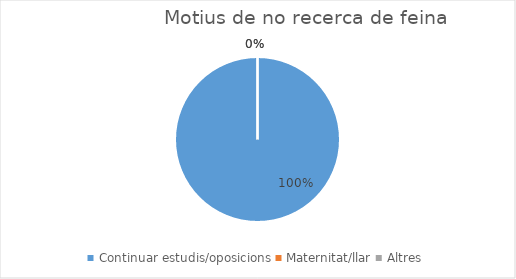
| Category | Series 0 |
|---|---|
| Continuar estudis/oposicions | 7 |
| Maternitat/llar | 0 |
| Altres | 0 |